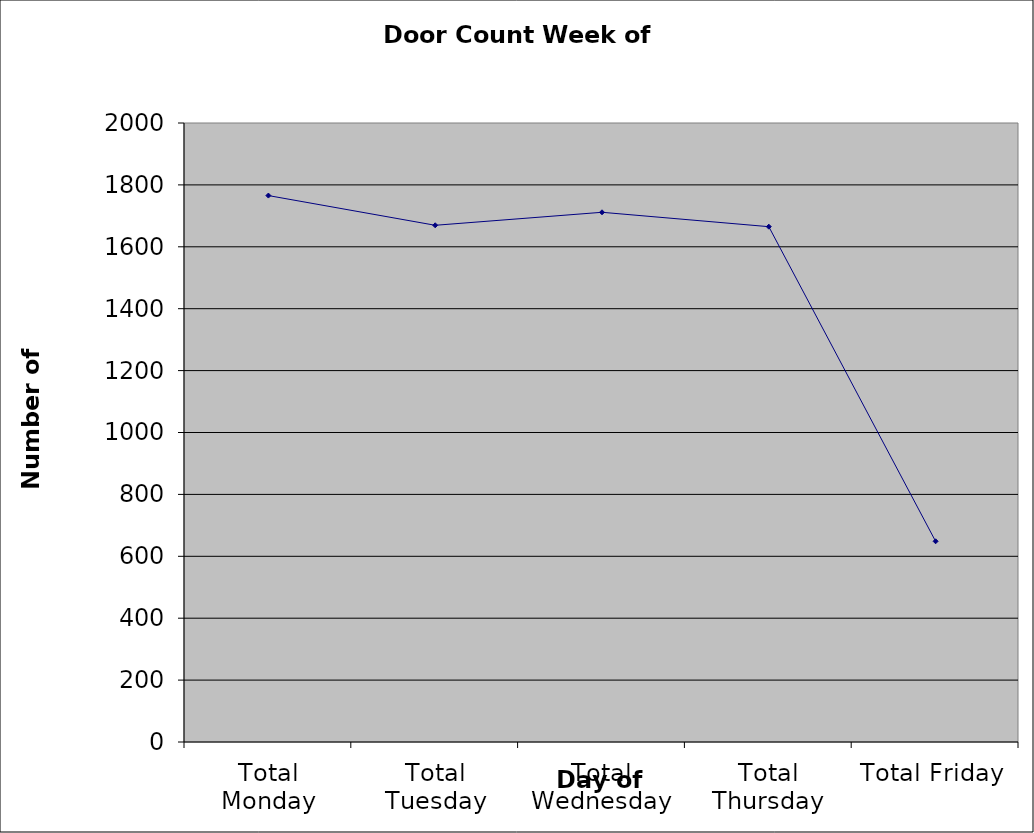
| Category | Series 0 |
|---|---|
| Total Monday | 1765.5 |
| Total Tuesday | 1669.5 |
| Total Wednesday | 1711.5 |
| Total Thursday | 1665 |
| Total Friday | 648.5 |